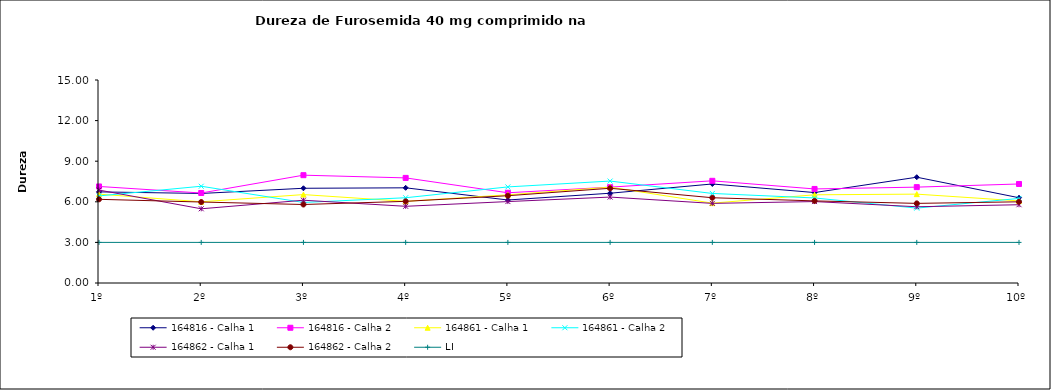
| Category | 164816 - Calha 1 | 164816 - Calha 2 | 164861 - Calha 1 | 164861 - Calha 2 | 164862 - Calha 1 | 164862 - Calha 2 | LI |
|---|---|---|---|---|---|---|---|
| 1º | 6.733 | 7.133 | 6.567 | 6.433 | 6.867 | 6.183 | 3 |
| 2º | 6.617 | 6.65 | 6 | 7.15 | 5.483 | 5.983 | 3 |
| 3º | 7 | 7.967 | 6.533 | 5.95 | 6.117 | 5.8 | 3 |
| 4º | 7.033 | 7.767 | 6.033 | 6.3 | 5.667 | 6.033 | 3 |
| 5º | 6.133 | 6.667 | 6.517 | 7.1 | 6.017 | 6.45 | 3 |
| 6º | 6.633 | 7.083 | 7.083 | 7.533 | 6.35 | 7 | 3 |
| 7º | 7.317 | 7.55 | 5.9 | 6.617 | 5.883 | 6.3 | 3 |
| 8º | 6.683 | 6.95 | 6.517 | 6.283 | 6.017 | 6.067 | 3 |
| 9º | 7.817 | 7.083 | 6.567 | 5.533 | 5.633 | 5.883 | 3 |
| 10º | 6.3 | 7.317 | 6.067 | 6.25 | 5.783 | 6 | 3 |